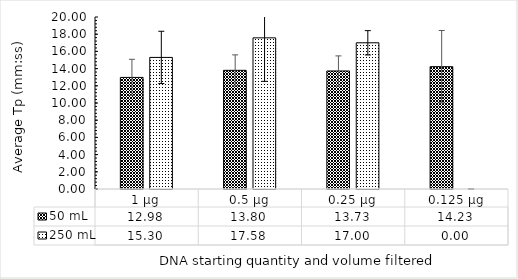
| Category | 50 mL  | 250 mL |
|---|---|---|
| 1 µg | 12.975 | 15.3 |
| 0.5 µg | 13.8 | 17.575 |
| 0.25 µg | 13.725 | 17 |
| 0.125 µg | 14.225 | 0 |